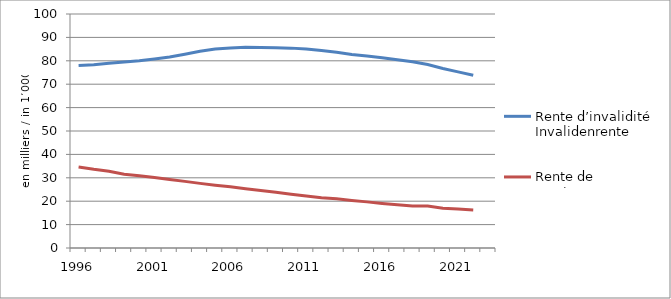
| Category | Rente d’invalidité | Rente de survivants |
|---|---|---|
|  1996 | 77.988 | 34.62 |
|  1997 | 78.269 | 33.624 |
|  1998 | 78.951 | 32.776 |
|  1999 | 79.499 | 31.538 |
| 2000 | 80.005 | 30.913 |
|  2001 | 80.739 | 30.139 |
| 2002 | 81.593 | 29.285 |
| 2003 | 82.803 | 28.47 |
| 2004 | 84.053 | 27.619 |
| 2005 | 84.994 | 26.836 |
| 2006 | 85.465 | 26.154 |
| 2007 | 85.803 | 25.288 |
| 2008 | 85.638 | 24.549 |
| 2009 | 85.577 | 23.786 |
| 2010 | 85.416 | 23.011 |
| 2011 | 85.08 | 22.203 |
| 2012 | 84.4 | 21.488 |
| 2013 | 83.619 | 21.003 |
| 2014 | 82.738 | 20.332 |
| 2015 | 82.075 | 19.711 |
| 2016 | 81.308 | 19.043 |
| 2017 | 80.45 | 18.49 |
| 2018 | 79.599 | 17.999 |
| 2019 | 78.415 | 17.965 |
| 2020 | 76.708 | 17.027 |
| 2021 | 75.269 | 16.641 |
| 2022 | 73.827 | 16.231 |